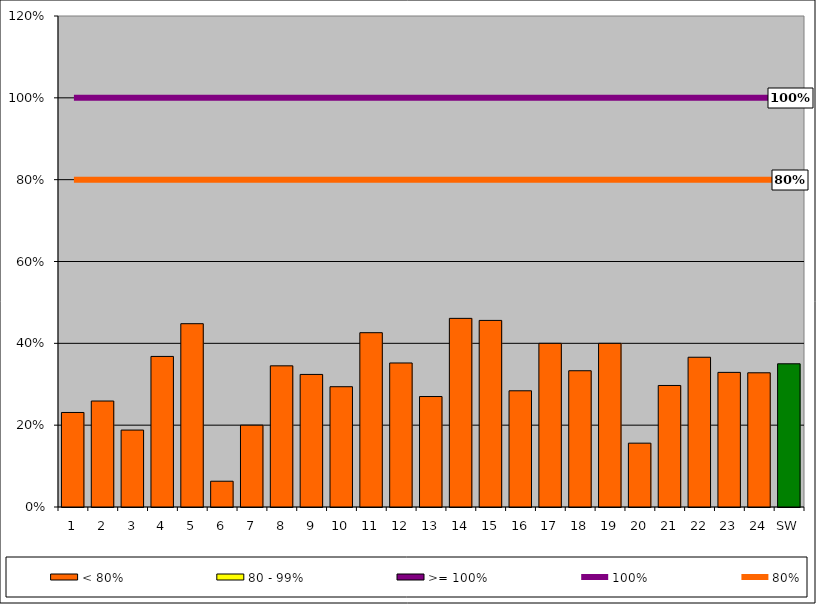
| Category | < 80% | 80 - 99% | >= 100% |
|---|---|---|---|
| 1 | 0.231 | 0 | 0 |
| 2 | 0.259 | 0 | 0 |
| 3 | 0.188 | 0 | 0 |
| 4 | 0.368 | 0 | 0 |
| 5 | 0.448 | 0 | 0 |
| 6 | 0.063 | 0 | 0 |
| 7 | 0.2 | 0 | 0 |
| 8 | 0.345 | 0 | 0 |
| 9 | 0.324 | 0 | 0 |
| 10 | 0.294 | 0 | 0 |
| 11 | 0.426 | 0 | 0 |
| 12 | 0.352 | 0 | 0 |
| 13 | 0.27 | 0 | 0 |
| 14 | 0.461 | 0 | 0 |
| 15 | 0.456 | 0 | 0 |
| 16 | 0.284 | 0 | 0 |
| 17 | 0.4 | 0 | 0 |
| 18 | 0.333 | 0 | 0 |
| 19 | 0.4 | 0 | 0 |
| 20 | 0.156 | 0 | 0 |
| 21 | 0.297 | 0 | 0 |
| 22 | 0.366 | 0 | 0 |
| 23 | 0.329 | 0 | 0 |
| 24 | 0.328 | 0 | 0 |
| SW | 0.35 | 0 | 0 |